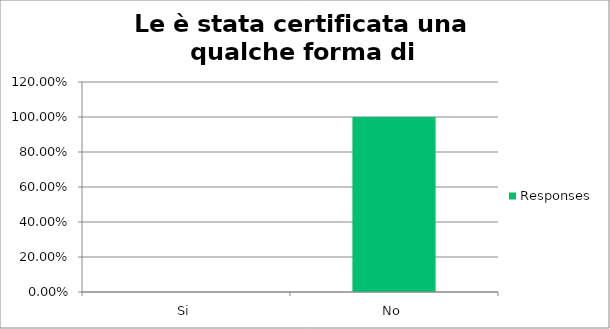
| Category | Responses |
|---|---|
| Si | 0 |
| No | 1 |